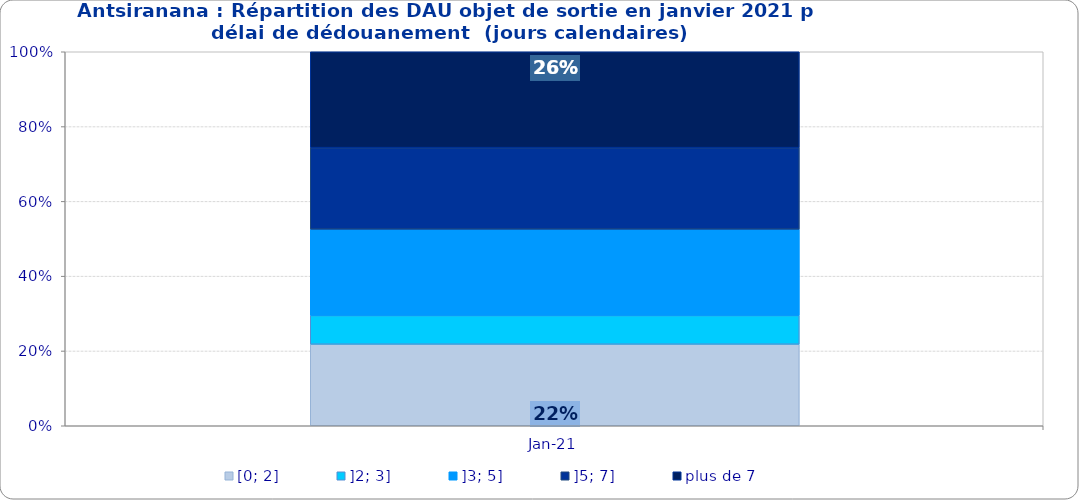
| Category | [0; 2] | ]2; 3] | ]3; 5] | ]5; 7] | plus de 7 |
|---|---|---|---|---|---|
| 2021-01-01 | 0.218 | 0.077 | 0.231 | 0.218 | 0.256 |